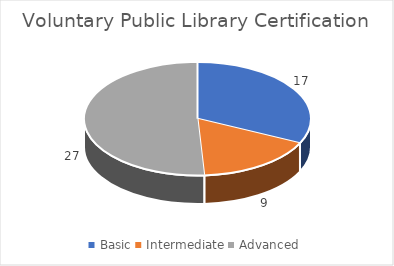
| Category | Series 0 |
|---|---|
| Basic | 17 |
| Intermediate | 9 |
| Advanced | 27 |